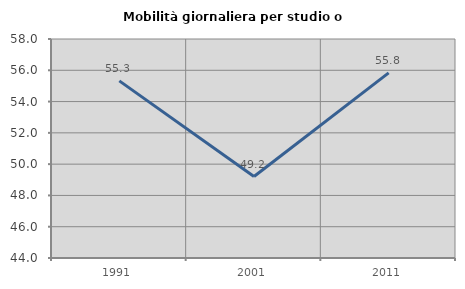
| Category | Mobilità giornaliera per studio o lavoro |
|---|---|
| 1991.0 | 55.324 |
| 2001.0 | 49.206 |
| 2011.0 | 55.838 |